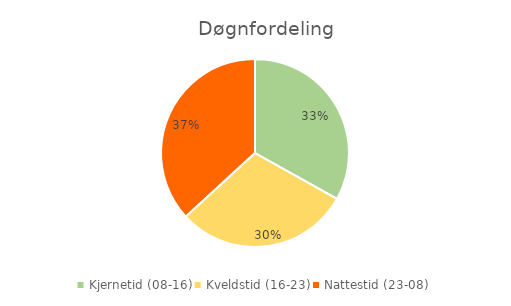
| Category | Series 0 |
|---|---|
| Kjernetid (08-16) | 0.331 |
| Kveldstid (16-23) | 0.301 |
| Nattestid (23-08) | 0.368 |